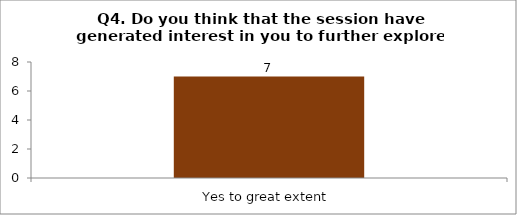
| Category | Q4. Do you think that the session have generated interest in you to further explore the topics? |
|---|---|
| Yes to great extent | 7 |